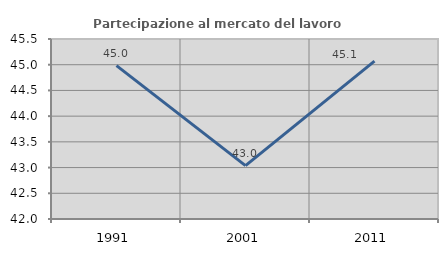
| Category | Partecipazione al mercato del lavoro  femminile |
|---|---|
| 1991.0 | 44.983 |
| 2001.0 | 43.038 |
| 2011.0 | 45.07 |